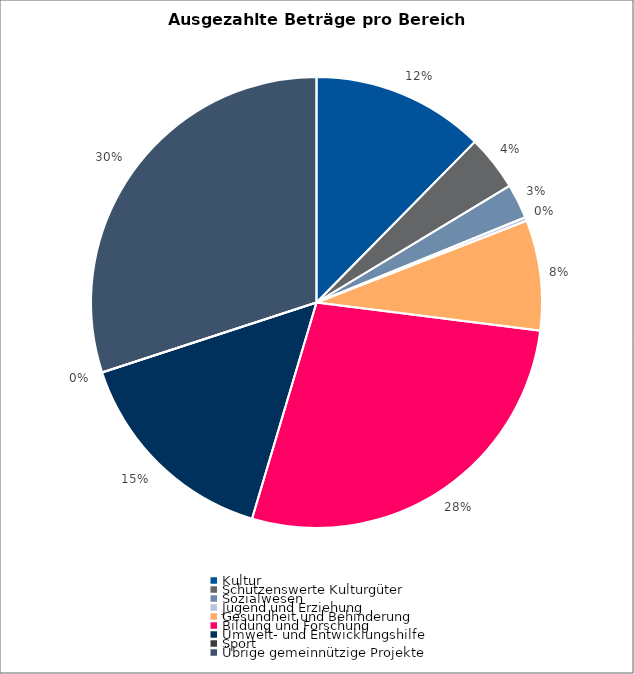
| Category | Series 0 |
|---|---|
| Kultur | 3131104 |
| Schützenswerte Kulturgüter | 1002000 |
| Sozialwesen | 629200 |
| Jugend und Erziehung | 67000 |
| Gesundheit und Behinderung | 1998600 |
| Bildung und Forschung | 6983472.64 |
| Umwelt- und Entwicklungshilfe | 3886774.5 |
| Sport | 0 |
| Übrige gemeinnützige Projekte | 7591791.4 |